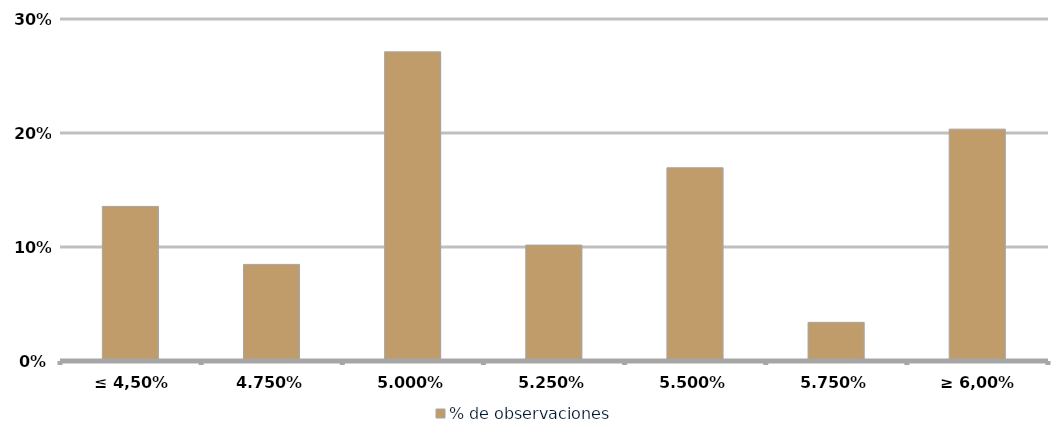
| Category | % de observaciones  |
|---|---|
| ≤ 4,50% | 0.136 |
| 4.75% | 0.085 |
| 5.00% | 0.271 |
| 5.25% | 0.102 |
| 5.50% | 0.169 |
| 5.75% | 0.034 |
| ≥ 6,00% | 0.203 |